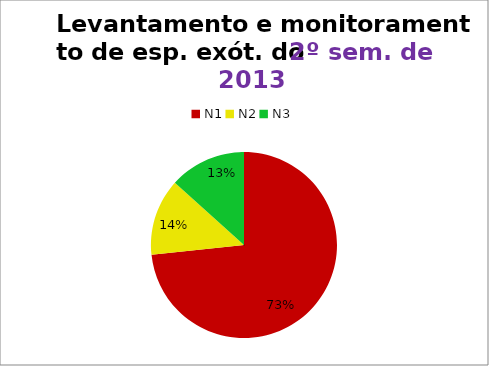
| Category | 2º/13 |
|---|---|
| N1 | 22 |
| N2 | 4 |
| N3 | 4 |